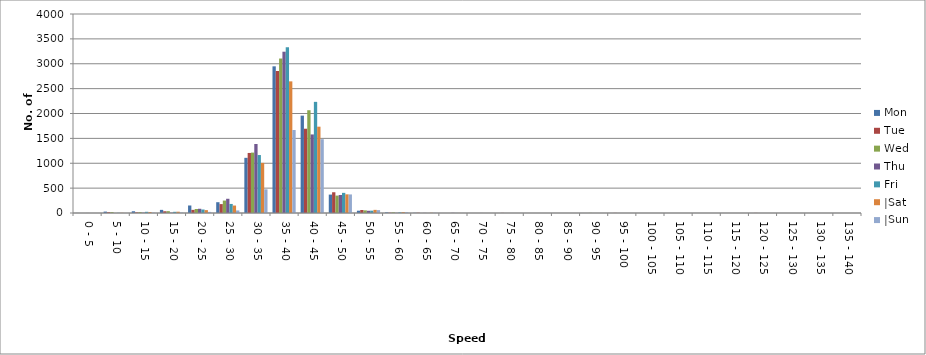
| Category | Mon | Tue | Wed | Thu | Fri | |Sat | |Sun |
|---|---|---|---|---|---|---|---|
| 0 - 5 | 1 | 0 | 0 | 1 | 0 | 0 | 0 |
| 5 - 10 | 28 | 16 | 18 | 0 | 3 | 3 | 0 |
| 10 - 15 | 35 | 13 | 19 | 7 | 24 | 20 | 6 |
| 15 - 20 | 63 | 35 | 37 | 6 | 24 | 26 | 8 |
| 20 - 25 | 151 | 63 | 81 | 85 | 70 | 58 | 22 |
| 25 - 30 | 217 | 179 | 250 | 286 | 182 | 150 | 51 |
| 30 - 35 | 1109 | 1207 | 1214 | 1387 | 1165 | 1007 | 476 |
| 35 - 40 | 2948 | 2854 | 3105 | 3242 | 3334 | 2646 | 1668 |
| 40 - 45 | 1957 | 1694 | 2066 | 1579 | 2234 | 1735 | 1484 |
| 45 - 50 | 370 | 417 | 350 | 362 | 405 | 375 | 373 |
| 50 - 55 | 46 | 60 | 53 | 45 | 47 | 63 | 58 |
| 55 - 60 | 12 | 7 | 13 | 4 | 12 | 17 | 14 |
| 60 - 65 | 4 | 5 | 0 | 2 | 0 | 4 | 4 |
| 65 - 70 | 0 | 0 | 0 | 3 | 1 | 1 | 1 |
| 70 - 75 | 0 | 0 | 0 | 1 | 0 | 0 | 0 |
| 75 - 80 | 0 | 2 | 0 | 0 | 0 | 0 | 0 |
| 80 - 85 | 0 | 0 | 0 | 0 | 0 | 0 | 0 |
| 85 - 90 | 0 | 0 | 0 | 0 | 0 | 0 | 0 |
| 90 - 95 | 0 | 0 | 2 | 0 | 0 | 0 | 0 |
| 95 - 100 | 0 | 2 | 0 | 0 | 0 | 0 | 0 |
| 100 - 105 | 0 | 0 | 0 | 0 | 0 | 0 | 0 |
| 105 - 110 | 0 | 0 | 0 | 0 | 0 | 0 | 0 |
| 110 - 115 | 0 | 0 | 0 | 0 | 0 | 0 | 0 |
| 115 - 120 | 0 | 0 | 0 | 0 | 0 | 0 | 0 |
| 120 - 125 | 0 | 2 | 0 | 0 | 0 | 0 | 0 |
| 125 - 130 | 0 | 0 | 0 | 0 | 0 | 0 | 0 |
| 130 - 135 | 0 | 0 | 0 | 0 | 0 | 0 | 0 |
| 135 - 140 | 0 | 0 | 0 | 0 | 0 | 0 | 0 |